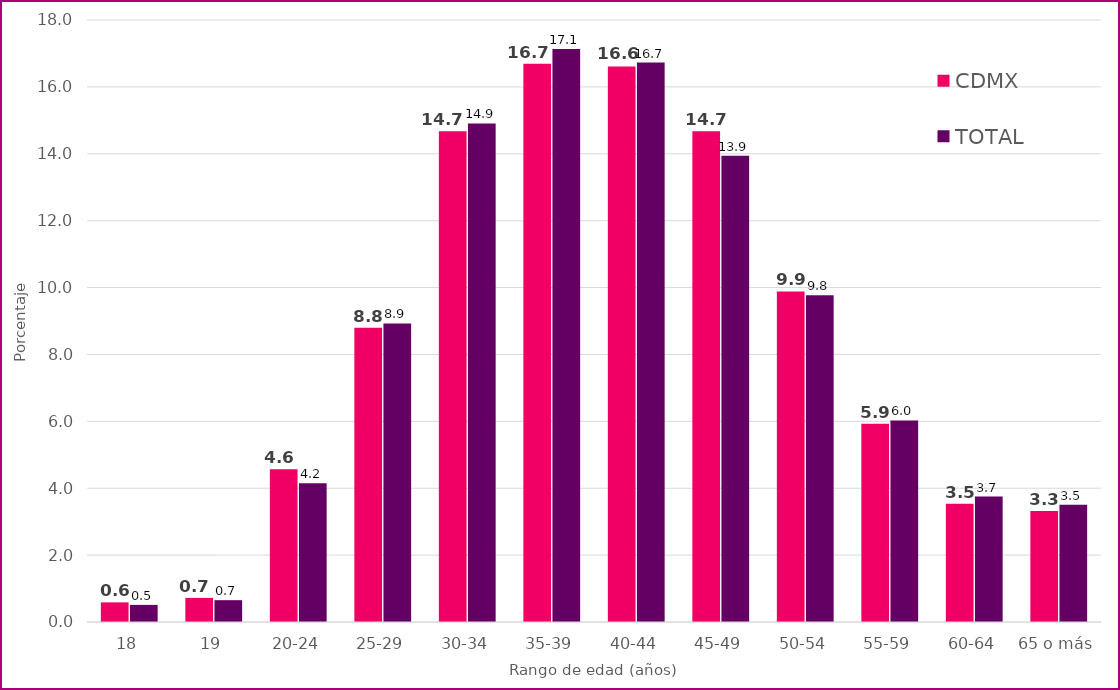
| Category | CDMX | TOTAL |
|---|---|---|
| 18 | 0.587 | 0.511 |
| 19 | 0.72 | 0.653 |
| 20-24 | 4.571 | 4.151 |
| 25-29 | 8.799 | 8.927 |
| 30-34 | 14.674 | 14.907 |
| 35-39 | 16.693 | 17.133 |
| 40-44 | 16.613 | 16.727 |
| 45-49 | 14.677 | 13.938 |
| 50-54 | 9.883 | 9.77 |
| 55-59 | 5.93 | 6.026 |
| 60-64 | 3.536 | 3.749 |
| 65 o más | 3.316 | 3.508 |